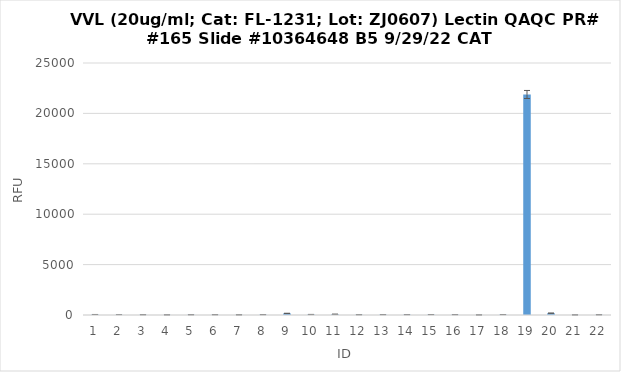
| Category | RFU |
|---|---|
| 0 | 49.75 |
| 1 | 17.75 |
| 2 | 30 |
| 3 | 16.75 |
| 4 | 29 |
| 5 | 31.75 |
| 6 | 20.5 |
| 7 | 39.25 |
| 8 | 162.25 |
| 9 | 50.5 |
| 10 | 72.5 |
| 11 | 32.25 |
| 12 | 39.5 |
| 13 | 38.75 |
| 14 | 43 |
| 15 | 38.5 |
| 16 | 11.25 |
| 17 | 44 |
| 18 | 21877 |
| 19 | 179.75 |
| 20 | 13 |
| 21 | 27.75 |